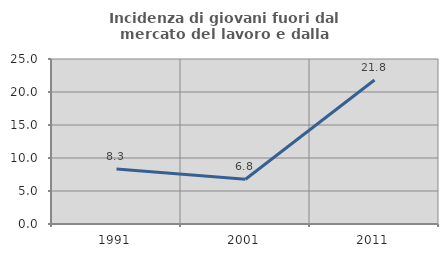
| Category | Incidenza di giovani fuori dal mercato del lavoro e dalla formazione  |
|---|---|
| 1991.0 | 8.333 |
| 2001.0 | 6.78 |
| 2011.0 | 21.818 |